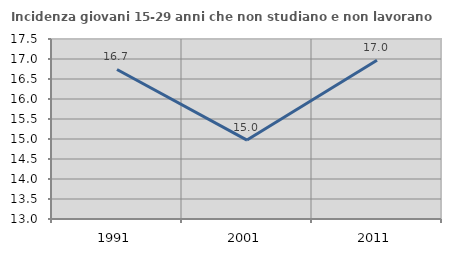
| Category | Incidenza giovani 15-29 anni che non studiano e non lavorano  |
|---|---|
| 1991.0 | 16.738 |
| 2001.0 | 14.973 |
| 2011.0 | 16.97 |